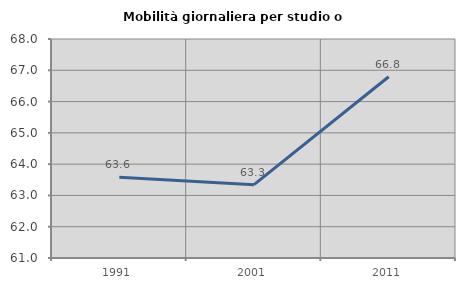
| Category | Mobilità giornaliera per studio o lavoro |
|---|---|
| 1991.0 | 63.579 |
| 2001.0 | 63.344 |
| 2011.0 | 66.794 |